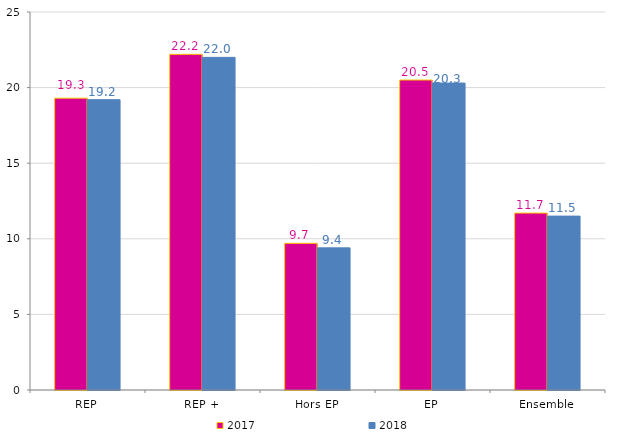
| Category | 2017 | 2018 |
|---|---|---|
| REP | 19.3 | 19.2 |
| REP + | 22.2 | 22 |
| Hors EP | 9.7 | 9.4 |
| EP | 20.5 | 20.3 |
| Ensemble | 11.7 | 11.5 |